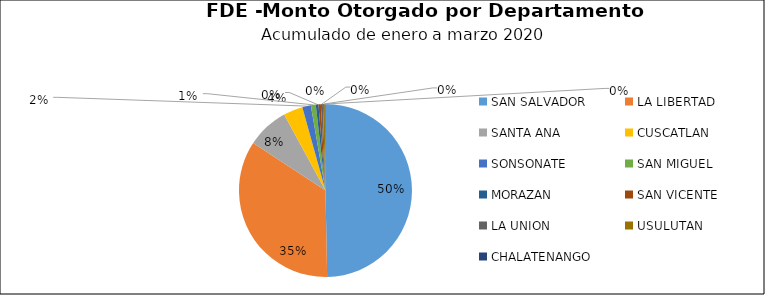
| Category | Monto | Créditos |
|---|---|---|
| SAN SALVADOR | 4.008 | 57 |
| LA LIBERTAD | 2.786 | 15 |
| SANTA ANA | 0.631 | 8 |
| CUSCATLAN | 0.291 | 3 |
| SONSONATE | 0.129 | 5 |
| SAN MIGUEL | 0.074 | 2 |
| MORAZAN | 0.04 | 1 |
| SAN VICENTE | 0.036 | 2 |
| LA UNION | 0.03 | 1 |
| USULUTAN | 0.029 | 2 |
| CHALATENANGO | 0.01 | 1 |